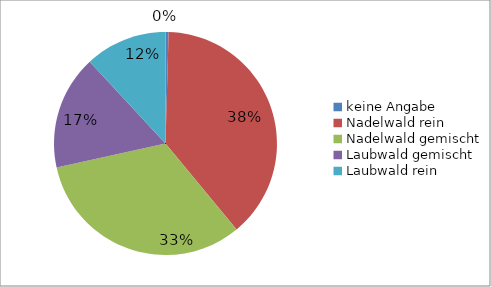
| Category | Kanton Luzern |
|---|---|
| keine Angabe | 175 |
| Nadelwald rein | 15074 |
| Nadelwald gemischt | 12730 |
| Laubwald gemischt | 6475 |
| Laubwald rein | 4649 |